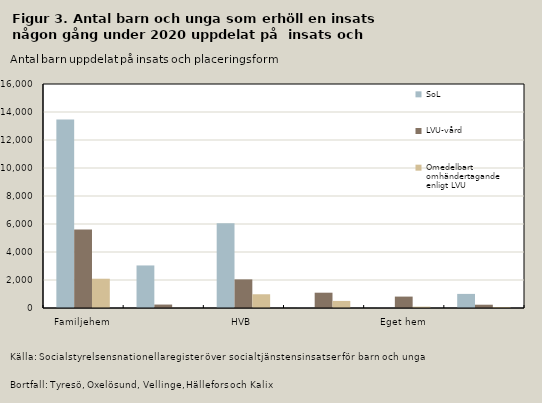
| Category | SoL | LVU-vård | Omedelbart 
omhändertagande 
enligt LVU |
|---|---|---|---|
| Familjehem | 13470 | 5605 | 2091 |
| Stödboende | 3039 | 246 | 14 |
| HVB | 6062 | 2044 | 982 |
| Särskilt ungdomshem enligt 12 § LVU | 10 | 1093 | 506 |
| Eget hem | 7 | 815 | 95 |
| Annan placeringsform        | 1007 | 235 | 70 |